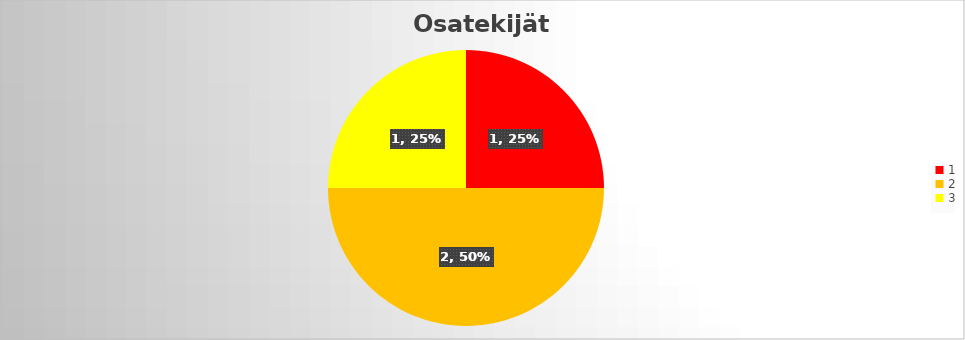
| Category | Summa |
|---|---|
| 1 | 1 |
| 2 | 2 |
| 3 | 1 |